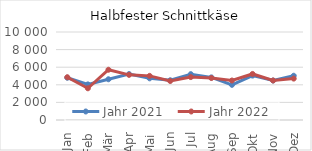
| Category | Jahr 2021 | Jahr 2022 |
|---|---|---|
| Jan | 4802.122 | 4859.572 |
| Feb | 4045.213 | 3603.803 |
| Mär | 4629.399 | 5711.005 |
| Apr | 5218.735 | 5129.989 |
| Mai | 4735.387 | 5014.839 |
| Jun | 4515.713 | 4432.599 |
| Jul | 5209.108 | 4877.658 |
| Aug | 4841.481 | 4769.335 |
| Sep | 3997.304 | 4487.63 |
| Okt | 5047.225 | 5233.099 |
| Nov | 4487.256 | 4488.34 |
| Dez | 5028.59 | 4705.399 |